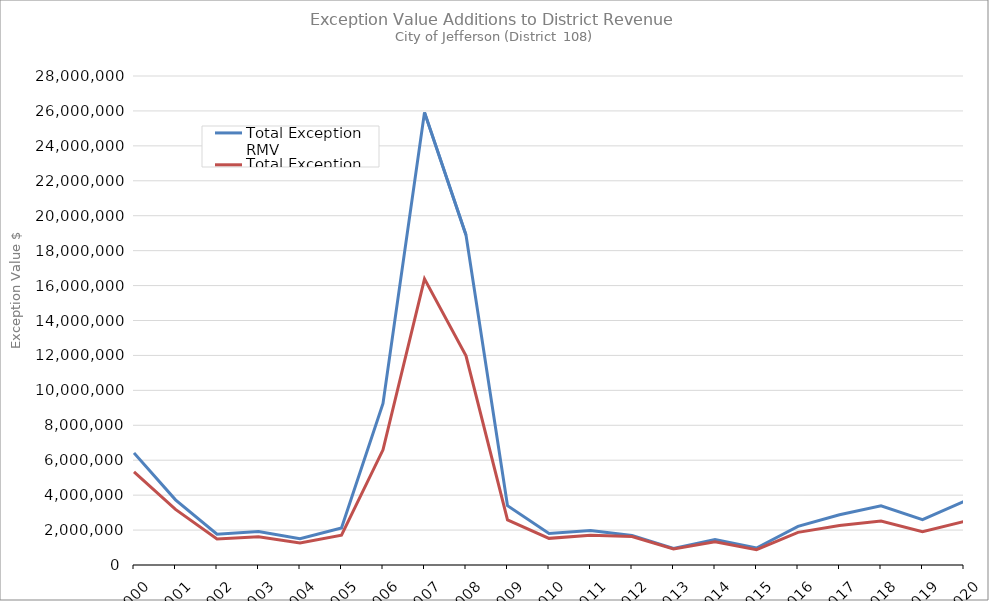
| Category | Total Exception RMV | Total Exception MAV |
|---|---|---|
| 2000.0 | 6419451 | 5326998 |
| 2001.0 | 3733241 | 3186131 |
| 2002.0 | 1764228 | 1486108 |
| 2003.0 | 1924023 | 1620447 |
| 2004.0 | 1501513 | 1254963 |
| 2005.0 | 2120016 | 1710356 |
| 2006.0 | 9249015 | 6595075 |
| 2007.0 | 25917818 | 16383968 |
| 2008.0 | 18895790 | 11974937 |
| 2009.0 | 3393759 | 2584459 |
| 2010.0 | 1810619 | 1524979 |
| 2011.0 | 1975283 | 1708923 |
| 2012.0 | 1684910 | 1633550 |
| 2013.0 | 942195 | 921386 |
| 2014.0 | 1461993 | 1329453 |
| 2015.0 | 975018 | 875939 |
| 2016.0 | 2210539 | 1868319 |
| 2017.0 | 2880897 | 2261687 |
| 2018.0 | 3391863 | 2518163 |
| 2019.0 | 2595480 | 1909020 |
| 2020.0 | 3636838 | 2489838 |